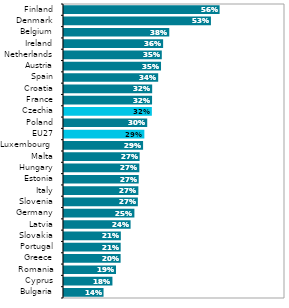
| Category | Series 1 |
|---|---|
| Bulgaria | 0.143 |
| Cyprus | 0.175 |
| Romania | 0.188 |
| Greece | 0.205 |
| Portugal | 0.205 |
| Slovakia | 0.206 |
| Latvia | 0.241 |
| Germany | 0.255 |
| Slovenia | 0.267 |
| Italy | 0.269 |
| Estonia | 0.27 |
| Hungary | 0.273 |
| Malta | 0.274 |
| Luxembourg  | 0.286 |
| EU27 | 0.291 |
| Poland | 0.301 |
| Czechia | 0.318 |
| France | 0.319 |
| Croatia | 0.319 |
| Spain | 0.341 |
| Austria | 0.351 |
| Netherlands | 0.354 |
| Ireland | 0.359 |
| Belgium | 0.381 |
| Denmark | 0.532 |
| Finland | 0.563 |